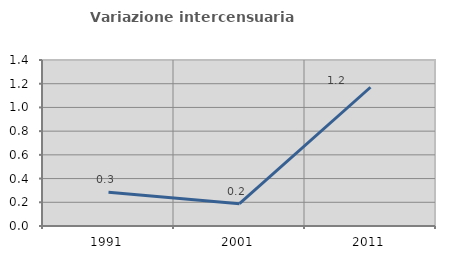
| Category | Variazione intercensuaria annua |
|---|---|
| 1991.0 | 0.286 |
| 2001.0 | 0.188 |
| 2011.0 | 1.17 |